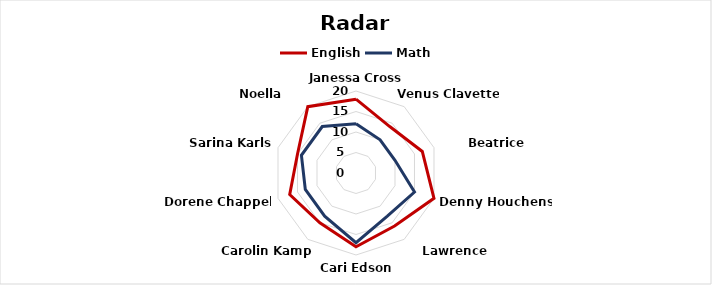
| Category | English | Math |
|---|---|---|
| Janessa Cross   | 18 | 12 |
| Venus Clavette   | 14 | 10 |
| Beatrice Stjames   | 17 | 10 |
| Denny Houchens   | 20 | 15 |
| Lawrence Mickles   | 16 | 13 |
| Cari Edson   | 18 | 17 |
| Carolin Kamp   | 15 | 13 |
| Dorene Chappel   | 17 | 13 |
| Sarina Karls   | 15 | 14 |
| Noella Goldblatt   | 20 | 14 |